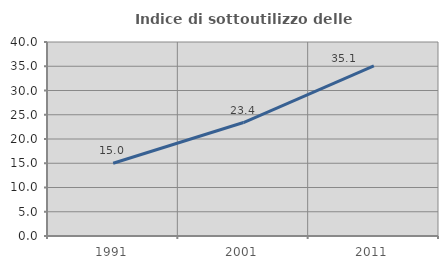
| Category | Indice di sottoutilizzo delle abitazioni  |
|---|---|
| 1991.0 | 15 |
| 2001.0 | 23.391 |
| 2011.0 | 35.06 |